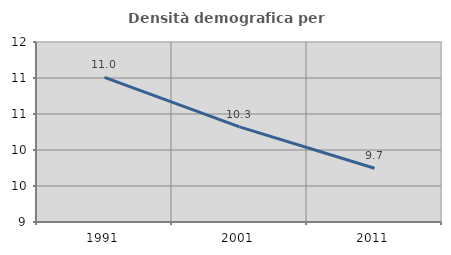
| Category | Densità demografica |
|---|---|
| 1991.0 | 11.008 |
| 2001.0 | 10.322 |
| 2011.0 | 9.746 |